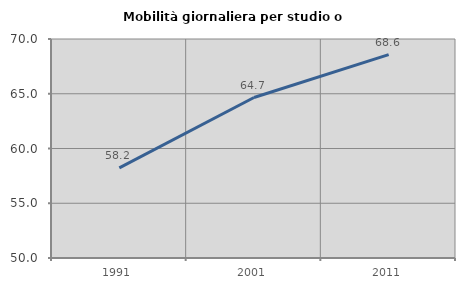
| Category | Mobilità giornaliera per studio o lavoro |
|---|---|
| 1991.0 | 58.232 |
| 2001.0 | 64.655 |
| 2011.0 | 68.579 |